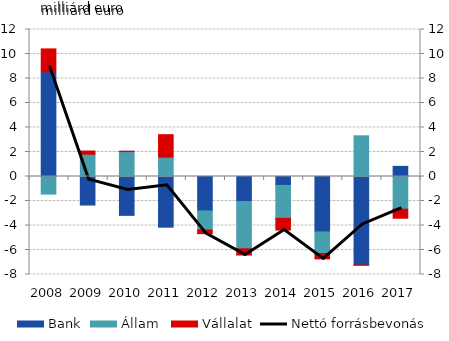
| Category | Bank | Állam  | Vállalat |
|---|---|---|---|
| 2008.0 | 8.54 | -1.437 | 1.876 |
| 2009.0 | -2.33 | 1.819 | 0.26 |
| 2010.0 | -3.173 | 2.035 | 0.033 |
| 2011.0 | -4.137 | 1.583 | 1.83 |
| 2012.0 | -2.812 | -1.551 | -0.303 |
| 2013.0 | -2.041 | -3.858 | -0.512 |
| 2014.0 | -0.731 | -2.683 | -0.959 |
| 2015.0 | -4.526 | -1.758 | -0.443 |
| 2016.0 | -7.221 | 3.323 | -0.013 |
| 2017.0 | 0.828 | -2.668 | -0.739 |